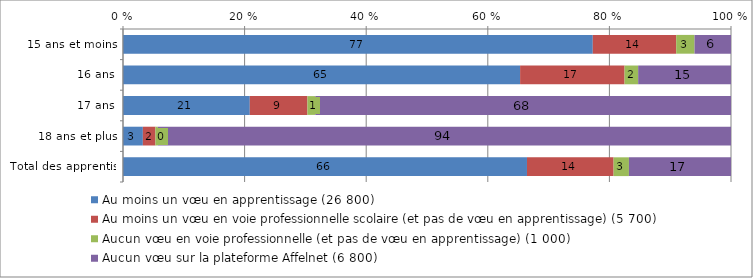
| Category | Au moins un vœu en apprentissage (26 800) | Au moins un vœu en voie professionnelle scolaire (et pas de vœu en apprentissage) (5 700) | Aucun vœu en voie professionnelle (et pas de vœu en apprentissage) (1 000) | Aucun vœu sur la plateforme Affelnet (6 800) |
|---|---|---|---|---|
| 15 ans et moins | 77.268 | 13.721 | 3.015 | 5.997 |
| 16 ans | 65.313 | 17.18 | 2.238 | 15.268 |
| 17 ans | 20.855 | 9.48 | 1.301 | 68.364 |
| 18 ans et plus | 3.267 | 2.067 | 0.4 | 94.267 |
| Total des apprentis | 66.445 | 14.244 | 2.524 | 16.788 |